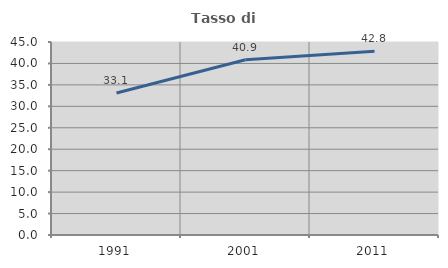
| Category | Tasso di occupazione   |
|---|---|
| 1991.0 | 33.091 |
| 2001.0 | 40.85 |
| 2011.0 | 42.831 |